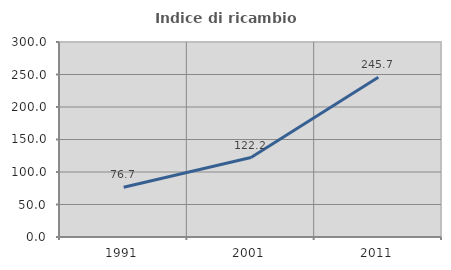
| Category | Indice di ricambio occupazionale  |
|---|---|
| 1991.0 | 76.667 |
| 2001.0 | 122.222 |
| 2011.0 | 245.745 |